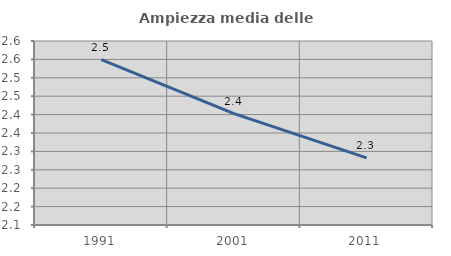
| Category | Ampiezza media delle famiglie |
|---|---|
| 1991.0 | 2.549 |
| 2001.0 | 2.403 |
| 2011.0 | 2.282 |